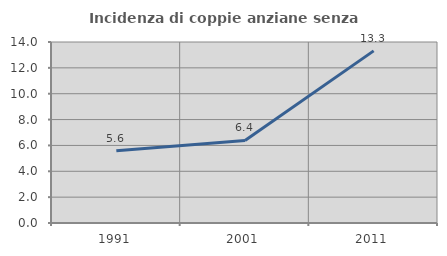
| Category | Incidenza di coppie anziane senza figli  |
|---|---|
| 1991.0 | 5.592 |
| 2001.0 | 6.383 |
| 2011.0 | 13.314 |